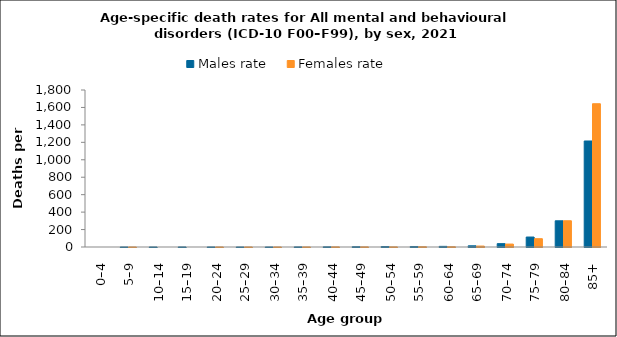
| Category | Males rate | Females rate |
|---|---|---|
| 0–4 | 0 | 0 |
| 5–9 | 0.12 | 0.127 |
| 10–14 | 0.12 | 0 |
| 15–19 | 0.525 | 0 |
| 20–24 | 0.358 | 0.254 |
| 25–29 | 0.109 | 0.221 |
| 30–34 | 0.319 | 0.313 |
| 35–39 | 1.077 | 0.532 |
| 40–44 | 2.084 | 1.431 |
| 45–49 | 3.548 | 1.561 |
| 50–54 | 5.666 | 1.346 |
| 55–59 | 5.77 | 3.3 |
| 60–64 | 7.171 | 3.051 |
| 65–69 | 13.764 | 10.715 |
| 70–74 | 38.4 | 33.61 |
| 75–79 | 114.222 | 95.147 |
| 80–84 | 300.446 | 300.901 |
| 85+ | 1215.418 | 1642.684 |